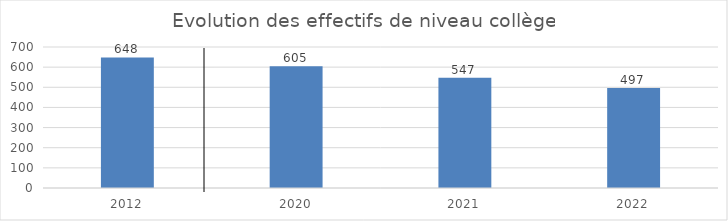
| Category | Series 0 |
|---|---|
| 2012.0 | 648 |
| 2020.0 | 605 |
| 2021.0 | 547 |
| 2022.0 | 497 |